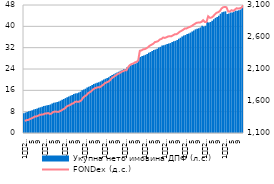
| Category | Укупнa нето имовина ДПФ (л.с.) |
|---|---|
| 1
2010. | 7.432 |
| 2 | 7.676 |
| 3 | 7.899 |
| 4 | 8.15 |
| 5 | 8.327 |
| 6 | 8.568 |
| 7 | 8.841 |
| 8 | 8.995 |
| 9 | 9.206 |
| 10 | 9.488 |
| 11 | 9.639 |
| 12 | 9.863 |
| 1
2011. | 10.082 |
| 2 | 10.238 |
| 3 | 10.435 |
| 4 | 10.51 |
| 5 | 10.725 |
| 6 | 11.067 |
| 7 | 11.306 |
| 8 | 11.45 |
| 9 | 11.587 |
| 10 | 11.853 |
| 11 | 12.123 |
| 12 | 12.452 |
| 1
2012. | 12.722 |
| 2 | 13.086 |
| 3 | 13.424 |
| 4 | 13.664 |
| 5 | 13.998 |
| 6 | 14.251 |
| 7 | 14.626 |
| 8 | 14.843 |
| 9 | 14.949 |
| 10 | 15.164 |
| 11 | 15.488 |
| 12 | 16.011 |
| 1
2013. | 16.312 |
| 2 | 16.606 |
| 3 | 17.045 |
| 4 | 17.324 |
| 5 | 17.63 |
| 6 | 18.041 |
| 7 | 18.363 |
| 8 | 18.611 |
| 9 | 18.841 |
| 10 | 18.989 |
| 11 | 19.318 |
| 12 | 19.701 |
| 1
2014. | 20.09 |
| 2 | 20.353 |
| 3 | 20.591 |
| 4 | 20.907 |
| 5 | 21.365 |
| 6 | 21.731 |
| 7 | 22.07 |
| 8 | 22.377 |
| 9 | 22.695 |
| 10 | 22.976 |
| 11 | 23.345 |
| 12 | 23.565 |
| 1
2015. | 23.891 |
| 2 | 23.98 |
| 3 | 24.649 |
| 4 | 25.107 |
| 5 | 25.375 |
| 6 | 25.527 |
| 7 | 25.849 |
| 8 | 26.048 |
| 9 | 26.4 |
| 10 | 28.345 |
| 11 | 28.533 |
| 12 | 28.875 |
| 1
2016. | 29.063 |
| 2 | 29.32 |
| 3 | 29.641 |
| 4 | 30.062 |
| 5 | 30.363 |
| 6 | 30.713 |
| 7 | 31.161 |
| 8 | 31.309 |
| 9 | 31.585 |
| 10 | 32.066 |
| 11 | 32.326 |
| 12 | 32.79 |
| 1
2017. | 32.869 |
| 2 | 33.119 |
| 3 | 33.378 |
| 4 | 33.567 |
| 5 | 33.733 |
| 6 | 34.082 |
| 7 | 34.431 |
| 8 | 34.568 |
| 9 | 34.884 |
| 10 | 35.366 |
| 11 | 35.717 |
| 12 | 36.152 |
| 1
2018. | 36.58 |
| 2 | 36.731 |
| 3 | 37.098 |
| 4 | 37.331 |
| 5 | 37.654 |
| 6 | 38.068 |
| 7 | 38.458 |
| 8 | 38.868 |
| 9 | 39.096 |
| 10 | 39.259 |
| 11 | 39.594 |
| 12 | 40.185 |
| 1
2019. | 39.918 |
| 2 | 40.205 |
| 3 | 41.641 |
| 4 | 41.434 |
| 5 | 41.619 |
| 6 | 42.072 |
| 7 | 42.658 |
| 8 | 43.177 |
| 9 | 43.484 |
| 10 | 43.928 |
| 11 | 44.725 |
| 12 | 45.246 |
| 1
2020. | 45.504 |
| 2 | 45.63 |
| 3 | 44.646 |
| 4 | 44.766 |
| 5 | 45.186 |
| 6 | 45.144 |
| 7 | 45.438 |
| 8 | 45.855 |
| 9 | 45.862 |
| 10 | 46.06 |
| 11 | 46.289 |
| 12 | 47.018 |